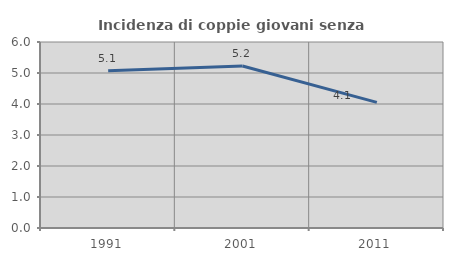
| Category | Incidenza di coppie giovani senza figli |
|---|---|
| 1991.0 | 5.069 |
| 2001.0 | 5.225 |
| 2011.0 | 4.052 |